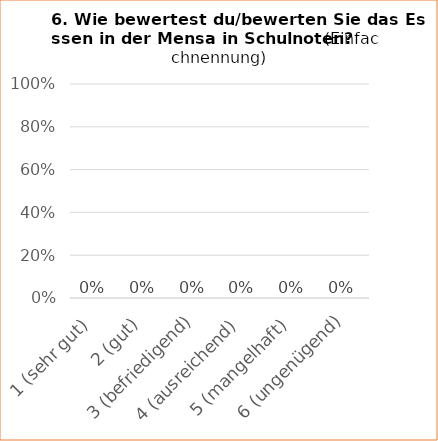
| Category | Series 1 |
|---|---|
| 1 (sehr gut) | 0 |
| 2 (gut) | 0 |
| 3 (befriedigend) | 0 |
| 4 (ausreichend) | 0 |
| 5 (mangelhaft) | 0 |
| 6 (ungenügend) | 0 |